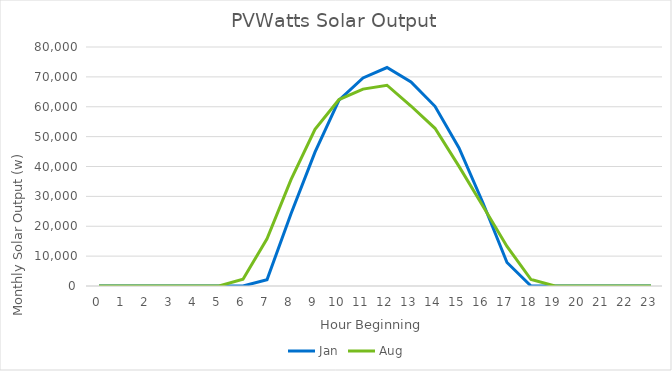
| Category | Jan | Aug |
|---|---|---|
| 0.0 | 0 | 0 |
| 1.0 | 0 | 0 |
| 2.0 | 0 | 0 |
| 3.0 | 0 | 0 |
| 4.0 | 0 | 0 |
| 5.0 | 0 | 0 |
| 6.0 | 0 | 2294.257 |
| 7.0 | 2109.65 | 15768.722 |
| 8.0 | 24180.525 | 35610.673 |
| 9.0 | 44795.505 | 52434.733 |
| 10.0 | 62195.498 | 62413.839 |
| 11.0 | 69628.904 | 65915.58 |
| 12.0 | 73121.135 | 67205.479 |
| 13.0 | 68274.703 | 60253.327 |
| 14.0 | 60146.228 | 52789.666 |
| 15.0 | 46187.509 | 40046.74 |
| 16.0 | 27786.509 | 26712.368 |
| 17.0 | 7875.451 | 13224.242 |
| 18.0 | 0 | 2173.365 |
| 19.0 | 0 | 0 |
| 20.0 | 0 | 0 |
| 21.0 | 0 | 0 |
| 22.0 | 0 | 0 |
| 23.0 | 0 | 0 |